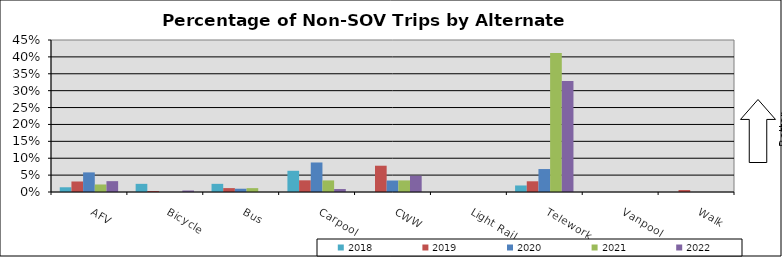
| Category | 2018 | 2019 | 2020 | 2021 | 2022 |
|---|---|---|---|---|---|
| AFV | 0.014 | 0.031 | 0.058 | 0.022 | 0.032 |
| Bicycle | 0.024 | 0.003 | 0 | 0 | 0.004 |
| Bus | 0.024 | 0.012 | 0.01 | 0.011 | 0 |
| Carpool | 0.063 | 0.035 | 0.087 | 0.034 | 0.009 |
| CWW | 0 | 0.078 | 0.034 | 0.034 | 0.048 |
| Light Rail | 0 | 0 | 0 | 0 | 0 |
| Telework | 0.019 | 0.032 | 0.068 | 0.411 | 0.329 |
| Vanpool | 0 | 0 | 0 | 0 | 0 |
| Walk | 0 | 0.006 | 0 | 0 | 0 |